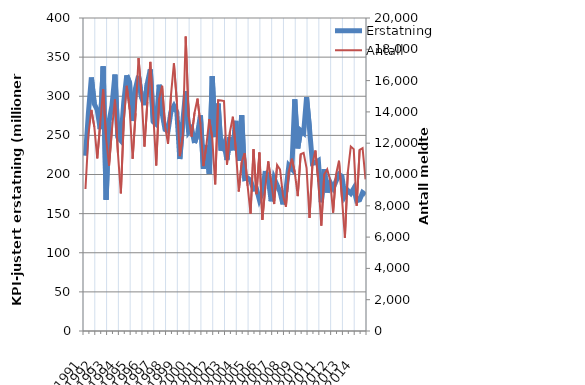
| Category | Erstatning |
|---|---|
| 1991.0 | 224.004 |
| nan | 278.701 |
| nan | 323.912 |
| nan | 290.109 |
| 1992.0 | 282.405 |
| nan | 258.04 |
| nan | 338.16 |
| nan | 167.714 |
| 1993.0 | 267.55 |
| nan | 288.274 |
| nan | 327.744 |
| nan | 247.473 |
| 1994.0 | 243.261 |
| nan | 292.909 |
| nan | 326.717 |
| nan | 316.969 |
| 1995.0 | 268.377 |
| nan | 310.462 |
| nan | 326.029 |
| nan | 298.546 |
| 1996.0 | 288.624 |
| nan | 316.842 |
| nan | 334.294 |
| nan | 267.261 |
| 1997.0 | 264.232 |
| nan | 314.716 |
| nan | 278.564 |
| nan | 257.522 |
| 1998.0 | 255.602 |
| nan | 280.391 |
| nan | 287.517 |
| nan | 279.782 |
| 1999.0 | 219.796 |
| nan | 266.7 |
| nan | 306.511 |
| nan | 254.224 |
| 2000.0 | 259.141 |
| nan | 240.324 |
| nan | 252.088 |
| nan | 275.595 |
| 2001.0 | 207.244 |
| nan | 237.701 |
| nan | 200.728 |
| nan | 325.563 |
| 2002.0 | 247.873 |
| nan | 290.601 |
| nan | 230.457 |
| nan | 239.267 |
| 2003.0 | 218.61 |
| nan | 247.712 |
| nan | 230.981 |
| nan | 268.572 |
| 2004.0 | 217.508 |
| nan | 275.732 |
| nan | 194.81 |
| nan | 195.623 |
| 2005.0 | 192.286 |
| nan | 181.226 |
| nan | 181.978 |
| nan | 167.584 |
| 2006.0 | 176.819 |
| nan | 204.479 |
| nan | 195.021 |
| nan | 165.776 |
| 2007.0 | 195.039 |
| nan | 186.314 |
| nan | 177.691 |
| nan | 161.832 |
| 2008.0 | 179.801 |
| nan | 211.41 |
| nan | 207.185 |
| nan | 295.976 |
| 2009.0 | 233.497 |
| nan | 256.265 |
| nan | 253.058 |
| nan | 298.888 |
| 2010.0 | 258.589 |
| nan | 214.112 |
| nan | 214.991 |
| nan | 217.554 |
| 2011.0 | 164.553 |
| nan | 206.709 |
| nan | 176.997 |
| nan | 189.985 |
| 2012.0 | 182.676 |
| nan | 191.481 |
| nan | 200.115 |
| nan | 197.486 |
| 2013.0 | 172.77 |
| nan | 179.578 |
| nan | 175.887 |
| nan | 182.23 |
| 2014.0 | 166.5 |
| nan | 167.566 |
| nan | 176.903 |
| nan | 174.149 |